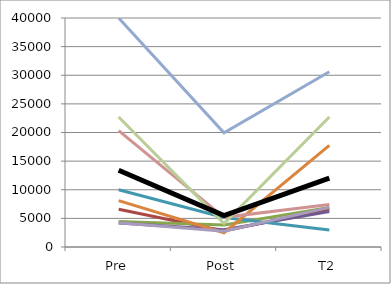
| Category | Series 0 | Series 1 | Series 2 | Series 3 | Series 4 | Series 5 | Series 6 | Series 7 | Series 8 | Series 9 | Mean |
|---|---|---|---|---|---|---|---|---|---|---|---|
| Pre |  | 6600 | 4459 | 4191 | 10000 | 8100 | 39998 | 20339 | 22696 | 4237 | 13402.222 |
| Post |  | 2820 | 3839 | 3000 | 5160 | 2496 | 19936 | 5179 | 4103 | 2749 | 5475.778 |
| T2 |  | 6642 | 6914 | 6199 | 2978 | 17758 | 30604 | 7436 | 22696 | 6916 | 12015.889 |